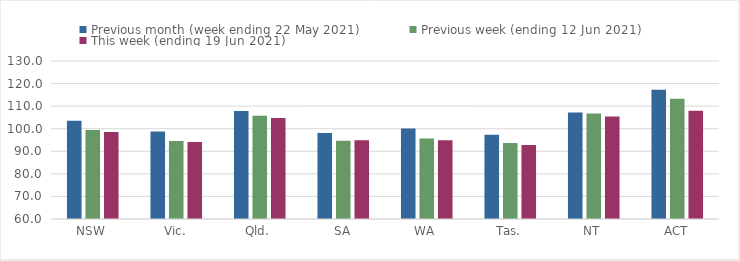
| Category | Previous month (week ending 22 May 2021) | Previous week (ending 12 Jun 2021) | This week (ending 19 Jun 2021) |
|---|---|---|---|
| NSW | 103.53 | 99.45 | 98.55 |
| Vic. | 98.75 | 94.59 | 94.13 |
| Qld. | 107.83 | 105.71 | 104.71 |
| SA | 98.15 | 94.72 | 94.88 |
| WA | 100.1 | 95.69 | 94.88 |
| Tas. | 97.28 | 93.65 | 92.79 |
| NT | 107.2 | 106.71 | 105.36 |
| ACT | 117.25 | 113.33 | 108 |